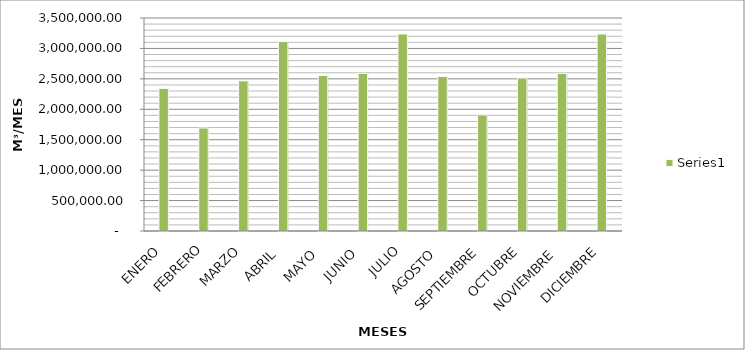
| Category | Series 0 |
|---|---|
| ENERO  | 2343059.83 |
| FEBRERO | 1691743.5 |
| MARZO | 2466348.65 |
| ABRIL  | 3113280.76 |
| MAYO  | 2554131.86 |
| JUNIO  | 2589578.79 |
| JULIO | 3236973.49 |
| AGOSTO  | 2538405.86 |
| SEPTIEMBRE | 1908366.76 |
| OCTUBRE | 2514672.75 |
| NOVIEMBRE  | 2589578.79 |
| DICIEMBRE | 3236973.49 |